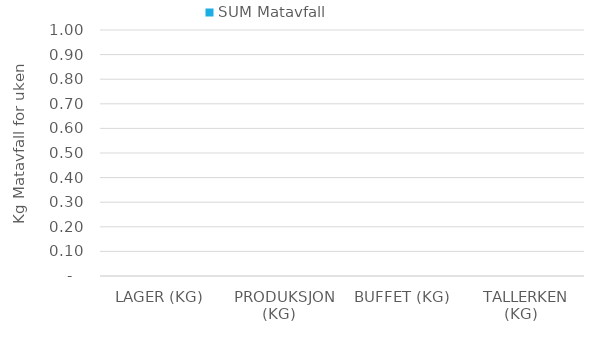
| Category | SUM Matavfall |
|---|---|
|  LAGER (KG)  | 0 |
|  PRODUKSJON (KG)  | 0 |
|  BUFFET (KG)  | 0 |
|  TALLERKEN (KG)  | 0 |